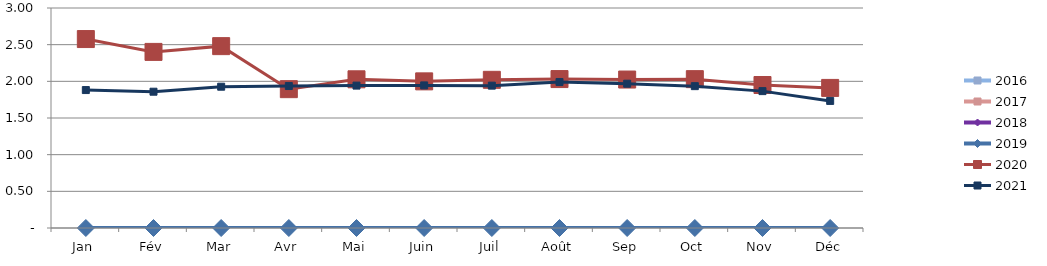
| Category | 2015 | 2016 | 2017 | 2018 | 2019 | 2020 | 2021 |
|---|---|---|---|---|---|---|---|
| Jan |  | 0 | 0 | 0 | 0 | 2.576 | 1.881 |
| Fév |  | 0 | 0 | 0 | 0 | 2.401 | 1.858 |
| Mar |  | 0 | 0 | 0 | 0 | 2.48 | 1.927 |
| Avr |  | 0 | 0 | 0 | 0 | 1.893 | 1.936 |
| Mai |  | 0 | 0 | 0 | 0 | 2.028 | 1.942 |
| Juin |  | 0 | 0 | 0 | 0 | 2 | 1.945 |
| Juil |  | 0 | 0 | 0 | 0 | 2.021 | 1.941 |
| Août |  | 0 | 0 | 0 | 0 | 2.031 | 1.991 |
| Sep |  | 0 | 0 | 0 | 0 | 2.024 | 1.968 |
| Oct |  | 0 | 0 | 0 | 0 | 2.03 | 1.934 |
| Nov |  | 0 | 0 | 0 | 0 | 1.95 | 1.867 |
| Déc |  | 0 | 0 | 0 | 0 | 1.91 | 1.733 |